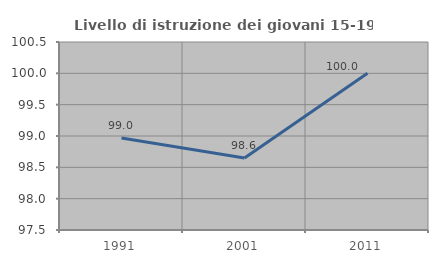
| Category | Livello di istruzione dei giovani 15-19 anni |
|---|---|
| 1991.0 | 98.969 |
| 2001.0 | 98.649 |
| 2011.0 | 100 |